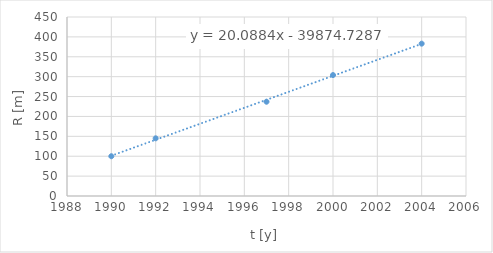
| Category | Series 0 |
|---|---|
| 1990.0 | 100 |
| 1992.0 | 145 |
| 1997.0 | 237 |
| 2000.0 | 304 |
| 2004.0 | 383 |